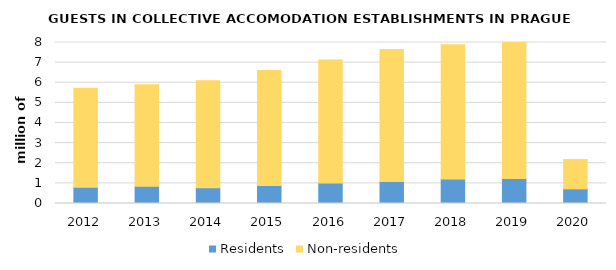
| Category | Residents | Non-residents |
|---|---|---|
| 2012 | 806997 | 4919457 |
| 2013 | 851674 | 5047956 |
| 2014 | 780961 | 5315054 |
| 2015 | 890941 | 5714835 |
| 2016 | 1016796 | 6110762 |
| 2017 | 1090243 | 6562518 |
| 2018 | 1221478 | 6670706 |
| 2019 | 1240583 | 6803741 |
| 2020 | 728913 | 1453530 |